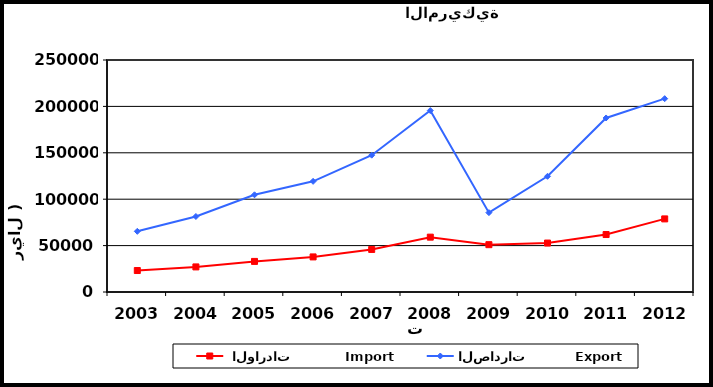
| Category |  الواردات           Import | الصادرات          Export |
|---|---|---|
| 2003.0 | 23150 | 65385 |
| 2004.0 | 27028 | 81360 |
| 2005.0 | 32952 | 104746 |
| 2006.0 | 37802 | 119239 |
| 2007.0 | 45852 | 147432 |
| 2008.0 | 59107 | 195521 |
| 2009.0 | 50999 | 85532 |
| 2010.0 | 52749 | 124675 |
| 2011.0 | 61943 | 187522 |
| 2012.0 | 78770 | 208339 |